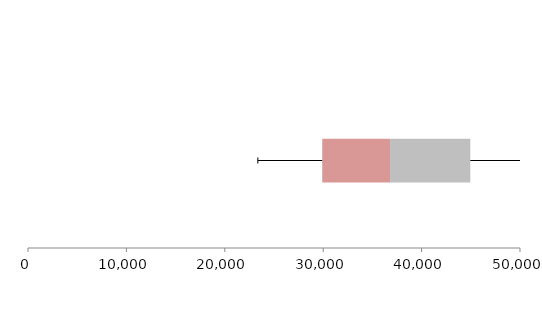
| Category | Series 1 | Series 2 | Series 3 |
|---|---|---|---|
| 0 | 29903.521 | 6890.724 | 8154.602 |